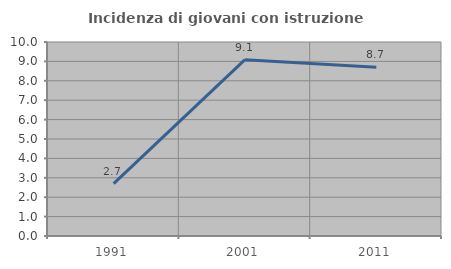
| Category | Incidenza di giovani con istruzione universitaria |
|---|---|
| 1991.0 | 2.703 |
| 2001.0 | 9.091 |
| 2011.0 | 8.696 |